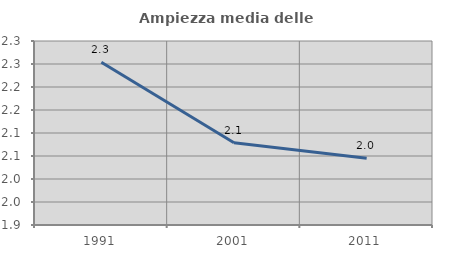
| Category | Ampiezza media delle famiglie |
|---|---|
| 1991.0 | 2.254 |
| 2001.0 | 2.079 |
| 2011.0 | 2.045 |